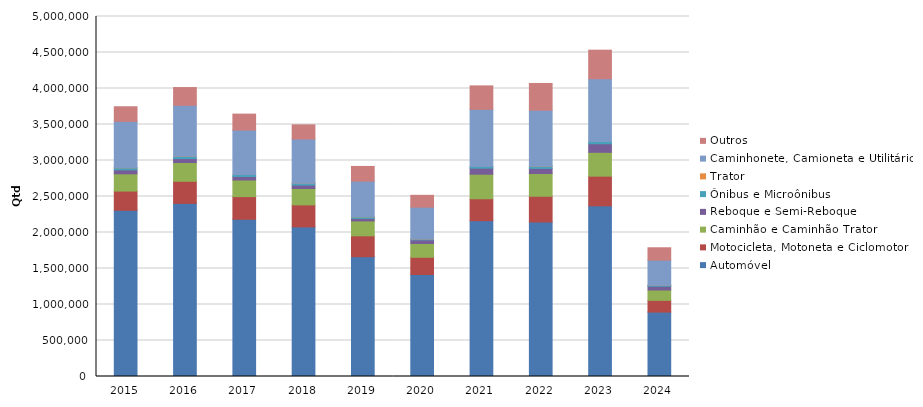
| Category | Automóvel | Motocicleta, Motoneta e Ciclomotor | Caminhão e Caminhão Trator | Reboque e Semi-Reboque | Ônibus e Microônibus | Trator | Caminhonete, Camioneta e Utilitário | Outros |
|---|---|---|---|---|---|---|---|---|
| 2015 | 2308249 | 267294 | 239569 | 54647 | 28985 | 320 | 645294 | 202200 |
| 2016 | 2404701 | 306138 | 261216 | 54425 | 30646 | 274 | 709590 | 245967 |
| 2017 | 2183678 | 314772 | 230591 | 48278 | 27749 | 217 | 617181 | 221915 |
| 2018 | 2077732 | 305918 | 227349 | 47247 | 26986 | 270 | 612732 | 197051 |
| 2019 | 1663618 | 290209 | 206729 | 34344 | 22677 | 249 | 495346 | 204468 |
| 2020 | 1416976 | 239068 | 191215 | 49930 | 12719 | 245 | 441614 | 164633 |
| 2021 | 2164225 | 304879 | 340514 | 83515 | 23678 | 368 | 793808 | 325162 |
| 2022 | 2146121 | 357213 | 316191 | 70510 | 29123 | 276 | 779106 | 371439 |
| 2023 | 2370564 | 411980 | 330985 | 118918 | 32572 | 356 | 870199 | 396753 |
| 2024 | 894315 | 163251 | 143875 | 52217 | 12870 | 131 | 349252 | 172037 |